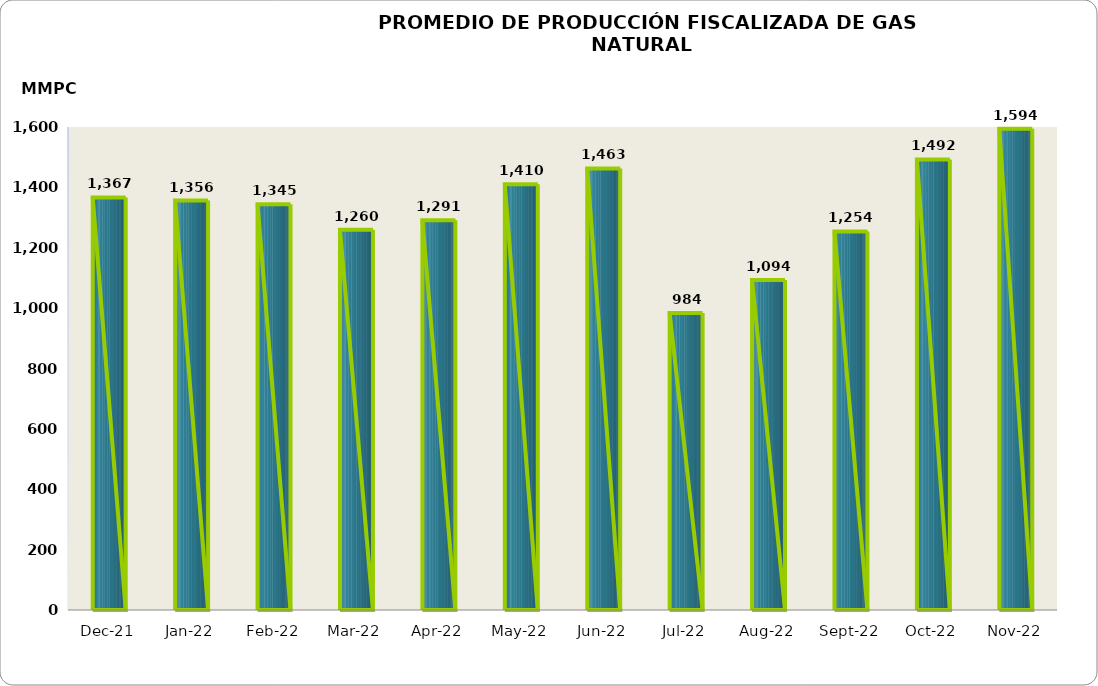
| Category | Series 0 |
|---|---|
| 2021-12-01 | 1366833.527 |
| 2022-01-01 | 1356402.082 |
| 2022-02-01 | 1344504.622 |
| 2022-03-01 | 1259914.198 |
| 2022-04-01 | 1291170.944 |
| 2022-05-01 | 1410361.644 |
| 2022-06-01 | 1462840.082 |
| 2022-07-01 | 983913.442 |
| 2022-08-01 | 1093528.82 |
| 2022-09-01 | 1253987.9 |
| 2022-10-01 | 1492396.38 |
| 2022-11-01 | 1593827.373 |